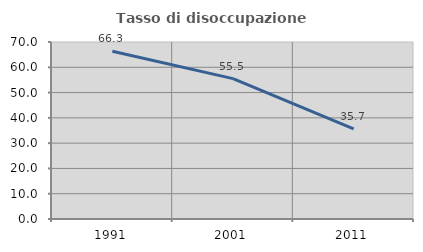
| Category | Tasso di disoccupazione giovanile  |
|---|---|
| 1991.0 | 66.323 |
| 2001.0 | 55.516 |
| 2011.0 | 35.681 |